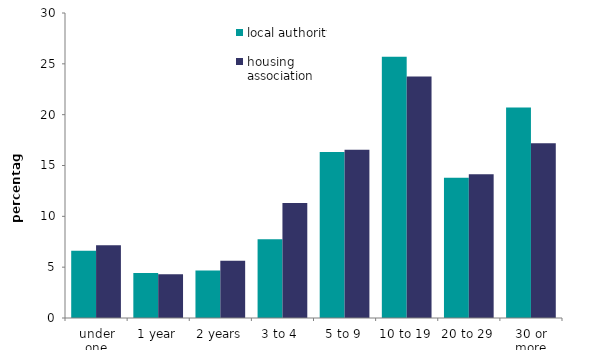
| Category | local authority | housing association |
|---|---|---|
| under one | 6.614 | 7.156 |
| 1 year | 4.424 | 4.3 |
| 2 years | 4.682 | 5.629 |
| 3 to 4  | 7.754 | 11.316 |
| 5 to 9 | 16.339 | 16.54 |
| 10 to 19 | 25.69 | 23.743 |
| 20 to 29 | 13.794 | 14.138 |
| 30 or more | 20.703 | 17.178 |